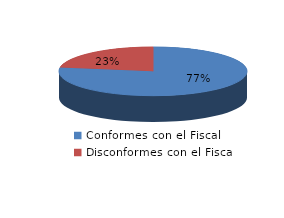
| Category | Series 0 |
|---|---|
| 0 | 770 |
| 1 | 224 |